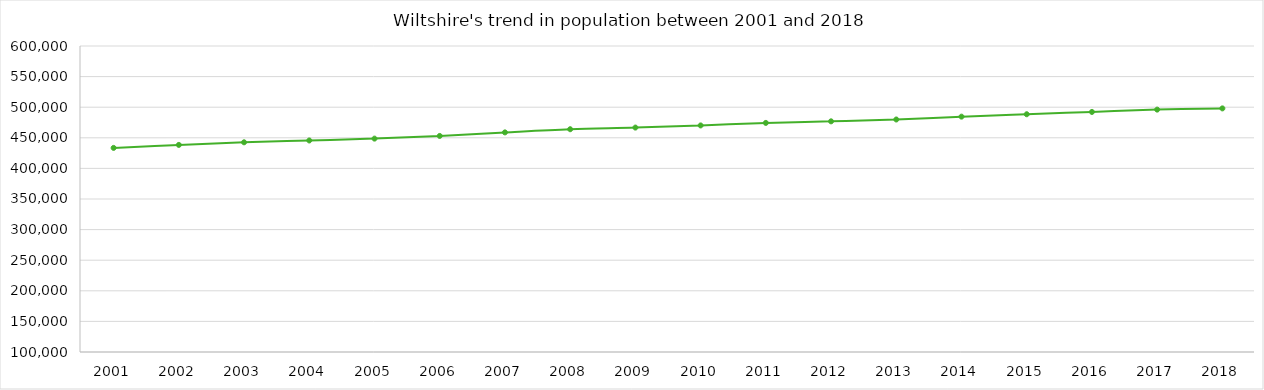
| Category | Total |
|---|---|
| 2001.0 | 433508 |
| 2002.0 | 438386 |
| 2003.0 | 442633 |
| 2004.0 | 445632 |
| 2005.0 | 448670 |
| 2006.0 | 453041 |
| 2007.0 | 458840 |
| 2008.0 | 464007 |
| 2009.0 | 466711 |
| 2010.0 | 470199 |
| 2011.0 | 474319 |
| 2012.0 | 476914 |
| 2013.0 | 479911 |
| 2014.0 | 484560 |
| 2015.0 | 488487 |
| 2016.0 | 492240 |
| 2017.0 | 496043 |
| 2018.0 | 498064 |